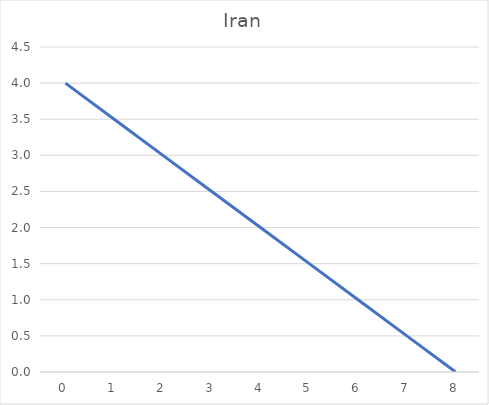
| Category | petroleo |
|---|---|
| 0.0 | 4 |
| 1.0 | 3.5 |
| 2.0 | 3 |
| 3.0 | 2.5 |
| 4.0 | 2 |
| 5.0 | 1.5 |
| 6.0 | 1 |
| 7.0 | 0.5 |
| 8.0 | 0 |